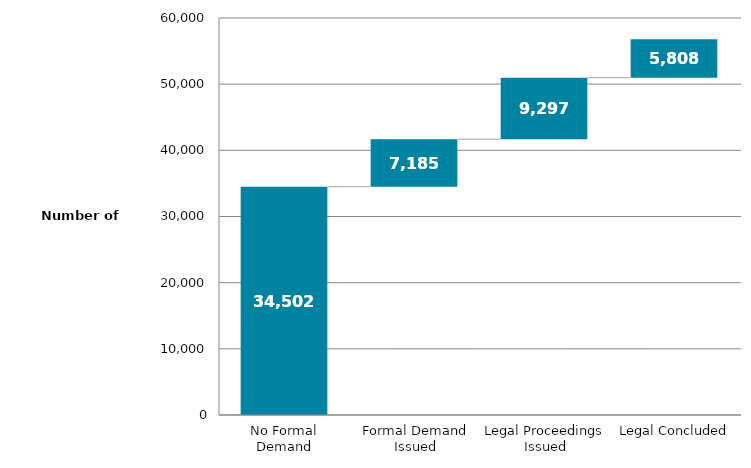
| Category | Series 0 |
|---|---|
| <= 1 YR SINCE First HEARING | 1726 |
| 1 TO 2 YRS SINCE First HEARING | 1060 |
| 2 TO 5 YRS SINCE First HEARING | 3916 |
| > 5 YRS SINCE First HEARING | 2595 |